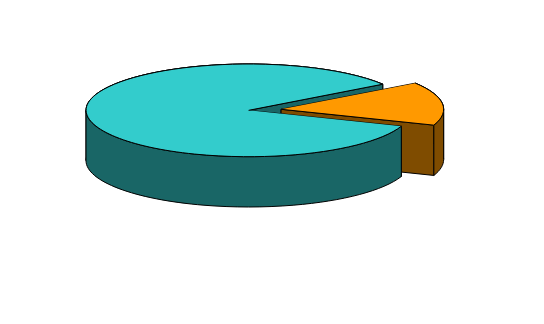
| Category | Series 0 | Series 1 | Series 2 |
|---|---|---|---|
| birinci nбvbцdц    1st shift    в первую смену | 84.9 | 84.9 | 84.9 |
| ikinci vц ъюъncъ nбvbцlцrdц              2 and  3 shift   во II и III смены        | 15.1 | 15.1 | 15.1 |